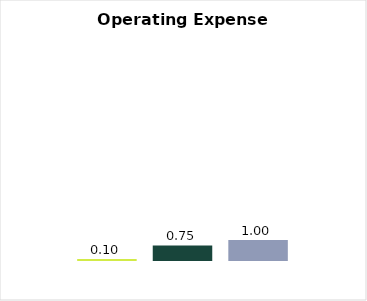
| Category | Min of OER | Average of OER | Max of OER |
|---|---|---|---|
| Total | 0.095 | 0.745 | 1 |